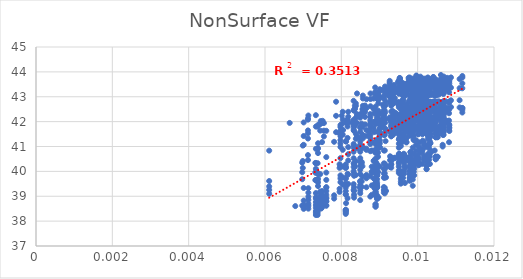
| Category | UTCI |
|---|---|
| 0.007333 | 41.801 |
| 0.008897 | 42.354 |
| 0.009115 | 42.436 |
| 0.009793 | 42.552 |
| 0.009893 | 42.621 |
| 0.010234 | 42.715 |
| 0.010282 | 42.77 |
| 0.010472 | 42.775 |
| 0.010515 | 42.787 |
| 0.010655 | 42.786 |
| 0.01067 | 42.8 |
| 0.007333 | 40.906 |
| 0.008897 | 41.915 |
| 0.009115 | 42.115 |
| 0.009793 | 42.474 |
| 0.009893 | 42.911 |
| 0.010234 | 43.022 |
| 0.010282 | 43.104 |
| 0.010472 | 43.135 |
| 0.010515 | 43.232 |
| 0.010655 | 43.233 |
| 0.01067 | 43.259 |
| 0.007333 | 40.328 |
| 0.008897 | 41.163 |
| 0.009115 | 41.752 |
| 0.009793 | 42.249 |
| 0.009893 | 42.954 |
| 0.010234 | 43.087 |
| 0.010282 | 43.181 |
| 0.010472 | 43.562 |
| 0.010515 | 43.586 |
| 0.010655 | 43.605 |
| 0.01067 | 43.638 |
| 0.007333 | 39.941 |
| 0.008897 | 40.753 |
| 0.009115 | 41.462 |
| 0.009793 | 41.677 |
| 0.009893 | 42.173 |
| 0.010234 | 42.326 |
| 0.010282 | 42.743 |
| 0.010472 | 43.111 |
| 0.010515 | 43.162 |
| 0.010655 | 43.194 |
| 0.01067 | 43.397 |
| 0.007333 | 39.65 |
| 0.008897 | 40.148 |
| 0.009115 | 40.839 |
| 0.009793 | 41.442 |
| 0.009893 | 41.636 |
| 0.010234 | 41.829 |
| 0.010282 | 42.291 |
| 0.010472 | 42.379 |
| 0.010515 | 42.444 |
| 0.010655 | 42.779 |
| 0.01067 | 43.118 |
| 0.007333 | 38.899 |
| 0.008897 | 39.919 |
| 0.009115 | 40.321 |
| 0.009793 | 40.58 |
| 0.009893 | 41.447 |
| 0.010234 | 41.664 |
| 0.010282 | 41.808 |
| 0.010472 | 42.223 |
| 0.010515 | 42.318 |
| 0.010655 | 42.383 |
| 0.01067 | 42.71 |
| 0.007333 | 38.765 |
| 0.008897 | 39.451 |
| 0.009115 | 40.1 |
| 0.009793 | 40.396 |
| 0.009893 | 41.278 |
| 0.010234 | 41.495 |
| 0.010282 | 41.667 |
| 0.010472 | 41.762 |
| 0.010515 | 42.188 |
| 0.010655 | 42.239 |
| 0.01067 | 42.303 |
| 0.007333 | 38.645 |
| 0.008897 | 39.325 |
| 0.009115 | 39.914 |
| 0.009793 | 40.198 |
| 0.009893 | 40.457 |
| 0.010234 | 41.036 |
| 0.010282 | 41.522 |
| 0.010472 | 41.642 |
| 0.010515 | 41.741 |
| 0.010655 | 41.837 |
| 0.01067 | 42.202 |
| 0.007333 | 38.536 |
| 0.008897 | 39.177 |
| 0.009115 | 39.746 |
| 0.009793 | 40.015 |
| 0.009893 | 40.269 |
| 0.010234 | 40.516 |
| 0.010282 | 41.062 |
| 0.010472 | 41.508 |
| 0.010515 | 41.613 |
| 0.010655 | 41.707 |
| 0.01067 | 41.798 |
| 0.007333 | 38.405 |
| 0.008897 | 39.055 |
| 0.009115 | 39.37 |
| 0.009793 | 39.889 |
| 0.009893 | 40.124 |
| 0.010234 | 40.391 |
| 0.010282 | 40.571 |
| 0.010472 | 41.369 |
| 0.010515 | 41.492 |
| 0.010655 | 41.584 |
| 0.01067 | 41.675 |
| 0.007333 | 38.334 |
| 0.008897 | 38.674 |
| 0.009115 | 39.249 |
| 0.009793 | 39.739 |
| 0.009893 | 39.994 |
| 0.010234 | 40.232 |
| 0.010282 | 40.455 |
| 0.010472 | 40.588 |
| 0.010515 | 41.375 |
| 0.010655 | 41.482 |
| 0.01067 | 41.572 |
| 0.007333 | 38.247 |
| 0.008897 | 38.587 |
| 0.009115 | 39.146 |
| 0.009793 | 39.629 |
| 0.009893 | 39.843 |
| 0.010234 | 40.092 |
| 0.010282 | 40.321 |
| 0.010472 | 40.488 |
| 0.010515 | 40.587 |
| 0.010655 | 41.068 |
| 0.01067 | 41.473 |
| 0.006647 | 41.948 |
| 0.008621 | 42.397 |
| 0.008354 | 42.508 |
| 0.009118 | 42.576 |
| 0.010105 | 42.635 |
| 0.009347 | 42.716 |
| 0.009812 | 42.768 |
| 0.010264 | 42.78 |
| 0.010136 | 42.79 |
| 0.010053 | 42.791 |
| 0.010415 | 42.802 |
| 0.007811 | 41.188 |
| 0.008621 | 41.885 |
| 0.008037 | 42.396 |
| 0.009118 | 42.662 |
| 0.010105 | 43.052 |
| 0.009347 | 43.035 |
| 0.009812 | 43.461 |
| 0.010058 | 43.497 |
| 0.010136 | 43.513 |
| 0.010053 | 43.521 |
| 0.010415 | 43.545 |
| 0.007319 | 40.34 |
| 0.008797 | 41.174 |
| 0.008037 | 42.086 |
| 0.009118 | 42.274 |
| 0.01032 | 42.68 |
| 0.009347 | 43.098 |
| 0.009812 | 43.359 |
| 0.010058 | 43.41 |
| 0.010136 | 43.597 |
| 0.009848 | 43.621 |
| 0.010415 | 43.643 |
| 0.007319 | 39.96 |
| 0.008797 | 40.841 |
| 0.008037 | 41.474 |
| 0.009308 | 42.02 |
| 0.01032 | 42.2 |
| 0.009705 | 42.35 |
| 0.009612 | 42.751 |
| 0.010058 | 43.114 |
| 0.010136 | 43.17 |
| 0.010053 | 43.367 |
| 0.010081 | 43.401 |
| 0.007319 | 39.649 |
| 0.008797 | 40.188 |
| 0.008037 | 40.866 |
| 0.009651 | 41.471 |
| 0.01032 | 41.679 |
| 0.009705 | 42.147 |
| 0.009612 | 42.301 |
| 0.010058 | 42.398 |
| 0.010136 | 42.733 |
| 0.009848 | 43.085 |
| 0.010081 | 43.136 |
| 0.007471 | 39.145 |
| 0.008797 | 39.947 |
| 0.008534 | 40.329 |
| 0.009651 | 41.274 |
| 0.01032 | 41.482 |
| 0.009705 | 41.686 |
| 0.009812 | 41.832 |
| 0.010058 | 42.239 |
| 0.010136 | 42.327 |
| 0.009848 | 42.399 |
| 0.010081 | 42.72 |
| 0.007811 | 39.038 |
| 0.008797 | 39.991 |
| 0.008534 | 40.379 |
| 0.009651 | 40.681 |
| 0.009678 | 41.594 |
| 0.009705 | 41.78 |
| 0.009612 | 41.959 |
| 0.010058 | 42.36 |
| 0.010136 | 42.46 |
| 0.009848 | 42.519 |
| 0.010081 | 42.605 |
| 0.007811 | 38.906 |
| 0.008495 | 39.582 |
| 0.008037 | 40.195 |
| 0.009651 | 40.5 |
| 0.01032 | 41.117 |
| 0.009705 | 41.335 |
| 0.009612 | 41.808 |
| 0.010058 | 41.928 |
| 0.010136 | 42.032 |
| 0.009848 | 42.427 |
| 0.010081 | 42.495 |
| 0.007471 | 38.804 |
| 0.008797 | 39.436 |
| 0.008037 | 39.756 |
| 0.009651 | 40.31 |
| 0.009678 | 40.595 |
| 0.009705 | 41.162 |
| 0.010315 | 41.361 |
| 0.010058 | 41.791 |
| 0.010136 | 41.89 |
| 0.009848 | 41.994 |
| 0.010415 | 42.091 |
| 0.007471 | 38.681 |
| 0.008797 | 39.056 |
| 0.008534 | 39.596 |
| 0.009651 | 40.187 |
| 0.009678 | 40.439 |
| 0.009507 | 40.664 |
| 0.010315 | 41.221 |
| 0.010058 | 41.661 |
| 0.010136 | 41.773 |
| 0.010053 | 41.877 |
| 0.010415 | 41.974 |
| 0.006794 | 38.605 |
| 0.00898 | 38.942 |
| 0.008037 | 39.472 |
| 0.009651 | 40.037 |
| 0.01032 | 40.297 |
| 0.010259 | 40.518 |
| 0.010315 | 40.727 |
| 0.010058 | 40.874 |
| 0.010136 | 41.66 |
| 0.010398 | 41.768 |
| 0.010415 | 41.874 |
| 0.007471 | 38.505 |
| 0.008495 | 38.845 |
| 0.008534 | 39.38 |
| 0.009651 | 39.916 |
| 0.009678 | 40.168 |
| 0.009507 | 40.366 |
| 0.010315 | 40.599 |
| 0.010058 | 40.763 |
| 0.010136 | 41.234 |
| 0.009848 | 41.659 |
| 0.010081 | 41.762 |
| 0.008285 | 41.962 |
| 0.008937 | 42.174 |
| 0.009871 | 42.522 |
| 0.009812 | 42.381 |
| 0.010016 | 42.655 |
| 0.010162 | 42.726 |
| 0.010559 | 42.787 |
| 0.010122 | 42.792 |
| 0.01083 | 42.803 |
| 0.01045 | 42.805 |
| 0.010555 | 42.815 |
| 0.007954 | 41.531 |
| 0.008937 | 41.976 |
| 0.009871 | 42.713 |
| 0.009812 | 42.971 |
| 0.010016 | 43.244 |
| 0.010162 | 43.341 |
| 0.010559 | 43.494 |
| 0.010122 | 43.517 |
| 0.01083 | 43.533 |
| 0.01045 | 43.545 |
| 0.010555 | 43.569 |
| 0.007954 | 40.141 |
| 0.008937 | 41.595 |
| 0.009871 | 41.862 |
| 0.009812 | 42.054 |
| 0.010016 | 42.767 |
| 0.010162 | 42.871 |
| 0.010559 | 43.137 |
| 0.010122 | 43.338 |
| 0.01083 | 43.366 |
| 0.009861 | 43.383 |
| 0.010555 | 43.482 |
| 0.007954 | 40.286 |
| 0.008937 | 41.111 |
| 0.009871 | 41.81 |
| 0.009616 | 42.347 |
| 0.010016 | 42.537 |
| 0.009959 | 42.97 |
| 0.009512 | 43.374 |
| 0.010122 | 43.588 |
| 0.01083 | 43.648 |
| 0.01045 | 43.69 |
| 0.010606 | 43.714 |
| 0.008116 | 39.702 |
| 0.008759 | 40.81 |
| 0.009871 | 41.56 |
| 0.009812 | 41.809 |
| 0.010016 | 42.312 |
| 0.009959 | 42.487 |
| 0.009512 | 42.631 |
| 0.010122 | 43.302 |
| 0.01083 | 43.363 |
| 0.009861 | 43.401 |
| 0.010606 | 43.613 |
| 0.008116 | 39.431 |
| 0.008937 | 40.292 |
| 0.009871 | 40.956 |
| 0.009812 | 41.61 |
| 0.010016 | 41.827 |
| 0.009959 | 42.321 |
| 0.010559 | 42.483 |
| 0.010122 | 42.572 |
| 0.010101 | 42.646 |
| 0.009861 | 43.023 |
| 0.010606 | 43.355 |
| 0.007954 | 39.301 |
| 0.008759 | 39.8 |
| 0.009871 | 40.433 |
| 0.009812 | 40.777 |
| 0.010039 | 41.662 |
| 0.009959 | 42.171 |
| 0.009512 | 42.032 |
| 0.010122 | 42.435 |
| 0.010101 | 42.532 |
| 0.009861 | 42.595 |
| 0.010606 | 42.659 |
| 0.007954 | 39.176 |
| 0.008937 | 39.903 |
| 0.009871 | 39.999 |
| 0.009812 | 40.573 |
| 0.010016 | 41.495 |
| 0.009959 | 41.713 |
| 0.009512 | 41.898 |
| 0.010122 | 42.301 |
| 0.010101 | 42.41 |
| 0.009861 | 42.505 |
| 0.010606 | 42.565 |
| 0.008116 | 39.07 |
| 0.008937 | 39.46 |
| 0.009871 | 39.838 |
| 0.009812 | 40.377 |
| 0.010039 | 40.978 |
| 0.009959 | 41.253 |
| 0.009512 | 41.745 |
| 0.010122 | 41.876 |
| 0.010101 | 42.277 |
| 0.009861 | 42.374 |
| 0.010287 | 42.482 |
| 0.008116 | 38.455 |
| 0.008937 | 39.347 |
| 0.009871 | 39.673 |
| 0.009812 | 40.279 |
| 0.010039 | 40.519 |
| 0.009959 | 41.066 |
| 0.009512 | 41.319 |
| 0.010122 | 41.749 |
| 0.01083 | 41.855 |
| 0.01045 | 41.949 |
| 0.010287 | 42.358 |
| 0.008116 | 38.386 |
| 0.008759 | 38.987 |
| 0.009667 | 39.534 |
| 0.009812 | 40.136 |
| 0.010016 | 40.368 |
| 0.009959 | 40.6 |
| 0.009952 | 40.836 |
| 0.010122 | 41.62 |
| 0.01083 | 41.757 |
| 0.010241 | 41.852 |
| 0.010555 | 42.255 |
| 0.008116 | 38.29 |
| 0.008937 | 38.889 |
| 0.009871 | 39.42 |
| 0.009616 | 39.737 |
| 0.010039 | 40.263 |
| 0.009959 | 40.46 |
| 0.009512 | 40.703 |
| 0.010122 | 40.858 |
| 0.01083 | 41.622 |
| 0.009861 | 41.753 |
| 0.010606 | 41.861 |
| 0.00751 | 42.032 |
| 0.008495 | 42.239 |
| 0.009433 | 42.333 |
| 0.009308 | 42.405 |
| 0.009725 | 42.465 |
| 0.009848 | 42.544 |
| 0.01032 | 42.596 |
| 0.009717 | 42.607 |
| 0.009762 | 42.611 |
| 0.010614 | 42.611 |
| 0.010411 | 42.623 |
| 0.007447 | 41.637 |
| 0.008495 | 42.156 |
| 0.008846 | 42.93 |
| 0.009308 | 42.973 |
| 0.009725 | 43.355 |
| 0.009848 | 43.174 |
| 0.01032 | 43.53 |
| 0.010058 | 43.555 |
| 0.009762 | 43.573 |
| 0.010614 | 43.58 |
| 0.010411 | 43.598 |
| 0.008124 | 41.201 |
| 0.008322 | 41.951 |
| 0.008846 | 42.531 |
| 0.009308 | 43.14 |
| 0.009395 | 43.265 |
| 0.009848 | 43.456 |
| 0.01032 | 43.698 |
| 0.010058 | 43.736 |
| 0.009762 | 43.758 |
| 0.010267 | 43.775 |
| 0.010411 | 43.793 |
| 0.008124 | 40.169 |
| 0.008495 | 41.068 |
| 0.008846 | 41.973 |
| 0.009506 | 42.201 |
| 0.009395 | 42.801 |
| 0.010259 | 43.25 |
| 0.010273 | 43.36 |
| 0.010058 | 43.415 |
| 0.009762 | 43.454 |
| 0.010614 | 43.548 |
| 0.010199 | 43.73 |
| 0.007447 | 39.892 |
| 0.008495 | 40.79 |
| 0.008846 | 41.749 |
| 0.009308 | 41.984 |
| 0.009395 | 42.186 |
| 0.010259 | 42.627 |
| 0.010273 | 43.043 |
| 0.010058 | 43.306 |
| 0.009762 | 43.345 |
| 0.010267 | 43.388 |
| 0.010199 | 43.424 |
| 0.007606 | 39.363 |
| 0.008322 | 40.528 |
| 0.008657 | 40.863 |
| 0.009308 | 41.811 |
| 0.009395 | 42.003 |
| 0.010259 | 42.219 |
| 0.01032 | 42.338 |
| 0.010058 | 42.998 |
| 0.009887 | 43.24 |
| 0.010267 | 43.308 |
| 0.010199 | 43.333 |
| 0.007447 | 39.19 |
| 0.008495 | 40.229 |
| 0.008657 | 40.913 |
| 0.009308 | 41.586 |
| 0.009635 | 42.127 |
| 0.010259 | 42.325 |
| 0.010273 | 42.49 |
| 0.010058 | 42.569 |
| 0.009887 | 42.649 |
| 0.010267 | 43.143 |
| 0.010199 | 43.508 |
| 0.007447 | 39.032 |
| 0.008495 | 40.065 |
| 0.008846 | 40.424 |
| 0.009308 | 41.412 |
| 0.009395 | 41.659 |
| 0.010259 | 41.874 |
| 0.010273 | 42.346 |
| 0.010058 | 42.457 |
| 0.009887 | 42.547 |
| 0.010267 | 42.625 |
| 0.010199 | 42.958 |
| 0.007606 | 38.918 |
| 0.008322 | 39.907 |
| 0.008846 | 40 |
| 0.009308 | 40.56 |
| 0.009635 | 41.504 |
| 0.010259 | 41.73 |
| 0.009783 | 42.216 |
| 0.010058 | 42.345 |
| 0.009887 | 42.435 |
| 0.010267 | 42.528 |
| 0.010203 | 42.607 |
| 0.007606 | 38.795 |
| 0.008322 | 39.487 |
| 0.008657 | 39.856 |
| 0.009308 | 40.426 |
| 0.009635 | 40.708 |
| 0.010259 | 41.606 |
| 0.009783 | 41.782 |
| 0.010058 | 42.223 |
| 0.009762 | 42.328 |
| 0.010614 | 42.424 |
| 0.010203 | 42.514 |
| 0.008124 | 38.722 |
| 0.008495 | 39.35 |
| 0.008657 | 39.722 |
| 0.009308 | 40.289 |
| 0.009395 | 40.548 |
| 0.010049 | 41.168 |
| 0.010312 | 41.666 |
| 0.010058 | 42.11 |
| 0.009762 | 42.228 |
| 0.010614 | 42.331 |
| 0.010411 | 42.419 |
| 0.007606 | 38.63 |
| 0.008495 | 39.233 |
| 0.008657 | 39.361 |
| 0.008951 | 40.18 |
| 0.009635 | 40.409 |
| 0.010259 | 41.017 |
| 0.009783 | 41.543 |
| 0.010058 | 41.704 |
| 0.009762 | 42.108 |
| 0.010267 | 42.226 |
| 0.010199 | 42.325 |
| 0.00746 | 42.021 |
| 0.009078 | 41.854 |
| 0.009628 | 42.279 |
| 0.009008 | 41.96 |
| 0.010362 | 42.429 |
| 0.009598 | 42.481 |
| 0.009785 | 42.537 |
| 0.009814 | 42.539 |
| 0.01117 | 42.54 |
| 0.009968 | 42.541 |
| 0.009965 | 42.558 |
| 0.007136 | 42.246 |
| 0.009078 | 42.128 |
| 0.008411 | 42.243 |
| 0.009008 | 43.008 |
| 0.010362 | 43.16 |
| 0.009598 | 43.231 |
| 0.009785 | 43.306 |
| 0.010686 | 43.325 |
| 0.01117 | 43.341 |
| 0.009968 | 43.337 |
| 0.009965 | 43.357 |
| 0.00699 | 41.037 |
| 0.008333 | 42.44 |
| 0.008411 | 43.132 |
| 0.009008 | 43.302 |
| 0.009144 | 43.411 |
| 0.009598 | 43.541 |
| 0.009785 | 43.776 |
| 0.010686 | 43.81 |
| 0.01117 | 43.834 |
| 0.009968 | 43.835 |
| 0.009965 | 43.855 |
| 0.00699 | 40.417 |
| 0.008333 | 41.894 |
| 0.008411 | 42.3 |
| 0.009195 | 43.118 |
| 0.009144 | 43.288 |
| 0.009598 | 43.435 |
| 0.009614 | 43.548 |
| 0.010686 | 43.747 |
| 0.01117 | 43.772 |
| 0.009968 | 43.786 |
| 0.010073 | 43.808 |
| 0.00699 | 40.137 |
| 0.008333 | 41.63 |
| 0.008411 | 41.946 |
| 0.009008 | 42.315 |
| 0.009144 | 43.13 |
| 0.009598 | 43.31 |
| 0.009614 | 43.438 |
| 0.010686 | 43.506 |
| 0.01117 | 43.537 |
| 0.009968 | 43.563 |
| 0.010073 | 43.753 |
| 0.007136 | 39.323 |
| 0.008333 | 41.051 |
| 0.008495 | 41.777 |
| 0.009008 | 42.005 |
| 0.009144 | 42.357 |
| 0.009598 | 43.212 |
| 0.009785 | 43.318 |
| 0.010686 | 43.402 |
| 0.009711 | 43.463 |
| 0.009968 | 43.501 |
| 0.010073 | 43.519 |
| 0.007136 | 39.143 |
| 0.008333 | 40.299 |
| 0.008495 | 41.591 |
| 0.009008 | 41.86 |
| 0.00981 | 42.116 |
| 0.009598 | 42.807 |
| 0.009614 | 43.251 |
| 0.010686 | 43.296 |
| 0.009711 | 43.373 |
| 0.009968 | 43.404 |
| 0.010073 | 43.45 |
| 0.007136 | 38.979 |
| 0.008333 | 39.822 |
| 0.008411 | 41.41 |
| 0.009008 | 41.71 |
| 0.009144 | 41.948 |
| 0.009598 | 42.399 |
| 0.009614 | 42.57 |
| 0.010686 | 43.231 |
| 0.009711 | 43.286 |
| 0.009968 | 43.342 |
| 0.010073 | 43.378 |
| 0.007136 | 38.855 |
| 0.008333 | 39.364 |
| 0.008411 | 40.929 |
| 0.009008 | 41.538 |
| 0.00981 | 41.84 |
| 0.009598 | 42.114 |
| 0.009698 | 42.453 |
| 0.010686 | 42.567 |
| 0.009711 | 43.206 |
| 0.009968 | 43.263 |
| 0.010032 | 43.319 |
| 0.007136 | 38.704 |
| 0.008333 | 39.212 |
| 0.008495 | 39.894 |
| 0.009008 | 41.426 |
| 0.00981 | 41.711 |
| 0.009598 | 42.02 |
| 0.009698 | 42.2 |
| 0.010686 | 42.467 |
| 0.01117 | 42.55 |
| 0.009968 | 42.896 |
| 0.010032 | 43.247 |
| 0.007136 | 38.613 |
| 0.008333 | 39.059 |
| 0.008495 | 39.451 |
| 0.009008 | 40.962 |
| 0.009144 | 41.551 |
| 0.009598 | 41.895 |
| 0.009698 | 42.104 |
| 0.010686 | 42.377 |
| 0.01117 | 42.477 |
| 0.009968 | 42.551 |
| 0.009965 | 42.901 |
| 0.007136 | 38.501 |
| 0.008333 | 38.943 |
| 0.008495 | 39.346 |
| 0.009195 | 40.203 |
| 0.00981 | 41.454 |
| 0.009598 | 41.771 |
| 0.009698 | 41.994 |
| 0.010686 | 42.298 |
| 0.01117 | 42.366 |
| 0.009968 | 42.46 |
| 0.010073 | 42.546 |
| 0.008046 | 41.661 |
| 0.008322 | 41.851 |
| 0.008534 | 41.919 |
| 0.009506 | 41.981 |
| 0.009539 | 42.038 |
| 0.009347 | 42.123 |
| 0.009267 | 42.17 |
| 0.00956 | 42.17 |
| 0.01034 | 42.17 |
| 0.009492 | 42.173 |
| 0.010407 | 42.185 |
| 0.007389 | 41.864 |
| 0.008322 | 42.043 |
| 0.008968 | 42.437 |
| 0.009506 | 42.237 |
| 0.009539 | 42.602 |
| 0.009347 | 42.426 |
| 0.009267 | 42.763 |
| 0.01013 | 42.778 |
| 0.01034 | 42.791 |
| 0.009492 | 42.786 |
| 0.010407 | 42.797 |
| 0.007543 | 41.941 |
| 0.008495 | 42.294 |
| 0.008354 | 42.639 |
| 0.009506 | 42.763 |
| 0.009611 | 42.863 |
| 0.009347 | 42.962 |
| 0.009267 | 43.027 |
| 0.01013 | 43.058 |
| 0.01034 | 43.065 |
| 0.010053 | 43.068 |
| 0.010407 | 43.076 |
| 0.007543 | 41.635 |
| 0.008621 | 42.647 |
| 0.008968 | 42.868 |
| 0.009118 | 43.021 |
| 0.009611 | 43.156 |
| 0.009705 | 43.435 |
| 0.009267 | 43.519 |
| 0.01013 | 43.554 |
| 0.01034 | 43.565 |
| 0.009492 | 43.571 |
| 0.010407 | 43.592 |
| 0.007543 | 41.404 |
| 0.008621 | 42.189 |
| 0.008968 | 42.736 |
| 0.008951 | 42.906 |
| 0.009611 | 43.05 |
| 0.009705 | 43.184 |
| 0.009267 | 43.29 |
| 0.01013 | 43.506 |
| 0.01034 | 43.514 |
| 0.010053 | 43.533 |
| 0.010407 | 43.55 |
| 0.007389 | 41.13 |
| 0.008495 | 41.757 |
| 0.009159 | 42.812 |
| 0.008951 | 43.021 |
| 0.009611 | 43.17 |
| 0.009705 | 43.336 |
| 0.009267 | 43.427 |
| 0.01013 | 43.484 |
| 0.010133 | 43.679 |
| 0.010053 | 43.711 |
| 0.010407 | 43.721 |
| 0.007389 | 40.931 |
| 0.008322 | 41.751 |
| 0.009159 | 42.658 |
| 0.008951 | 43.175 |
| 0.009611 | 43.364 |
| 0.009705 | 43.52 |
| 0.009267 | 43.639 |
| 0.01013 | 43.688 |
| 0.010133 | 43.728 |
| 0.010053 | 43.745 |
| 0.010407 | 43.789 |
| 0.007389 | 40.735 |
| 0.008495 | 41.346 |
| 0.008354 | 42.524 |
| 0.008951 | 43.068 |
| 0.009611 | 43.257 |
| 0.009705 | 43.434 |
| 0.009267 | 43.569 |
| 0.01013 | 43.639 |
| 0.010133 | 43.676 |
| 0.010053 | 43.72 |
| 0.010407 | 43.743 |
| 0.007389 | 39.908 |
| 0.008495 | 41.205 |
| 0.008354 | 41.836 |
| 0.008951 | 42.915 |
| 0.009611 | 43.172 |
| 0.009705 | 43.343 |
| 0.009806 | 43.489 |
| 0.01013 | 43.576 |
| 0.010133 | 43.62 |
| 0.010053 | 43.669 |
| 0.010419 | 43.715 |
| 0.007389 | 39.702 |
| 0.008495 | 41.049 |
| 0.009159 | 41.703 |
| 0.008951 | 42.262 |
| 0.009611 | 43.072 |
| 0.009347 | 43.279 |
| 0.009806 | 43.425 |
| 0.009919 | 43.519 |
| 0.01034 | 43.571 |
| 0.009492 | 43.621 |
| 0.010419 | 43.669 |
| 0.007389 | 39.558 |
| 0.008495 | 40.532 |
| 0.008722 | 41.588 |
| 0.008951 | 42.149 |
| 0.009611 | 42.38 |
| 0.009347 | 43.19 |
| 0.009806 | 43.362 |
| 0.01013 | 43.454 |
| 0.01034 | 43.535 |
| 0.009492 | 43.578 |
| 0.010407 | 43.628 |
| 0.007389 | 39.41 |
| 0.008495 | 40.388 |
| 0.009159 | 41.216 |
| 0.009308 | 42.051 |
| 0.009611 | 42.287 |
| 0.009347 | 42.809 |
| 0.009806 | 43.288 |
| 0.009919 | 43.403 |
| 0.01034 | 43.449 |
| 0.010053 | 43.535 |
| 0.010407 | 43.585 |
| 0.007977 | 41.628 |
| 0.008759 | 41.867 |
| 0.009368 | 41.869 |
| 0.009616 | 41.959 |
| 0.009831 | 42.01 |
| 0.009959 | 42.083 |
| 0.010063 | 42.15 |
| 0.010122 | 42.146 |
| 0.010202 | 42.151 |
| 0.010241 | 42.147 |
| 0.010295 | 42.163 |
| 0.007977 | 41.783 |
| 0.008759 | 41.841 |
| 0.009368 | 42.234 |
| 0.009616 | 42.317 |
| 0.009831 | 42.41 |
| 0.009959 | 42.489 |
| 0.010063 | 42.568 |
| 0.010122 | 42.569 |
| 0.010202 | 42.594 |
| 0.010241 | 42.587 |
| 0.010295 | 42.592 |
| 0.007977 | 41.525 |
| 0.008759 | 41.684 |
| 0.009368 | 42.288 |
| 0.009616 | 42.215 |
| 0.009831 | 42.599 |
| 0.009959 | 42.449 |
| 0.010063 | 42.746 |
| 0.010122 | 42.557 |
| 0.010202 | 42.769 |
| 0.010241 | 42.555 |
| 0.010295 | 42.778 |
| 0.007977 | 41.859 |
| 0.008759 | 42.305 |
| 0.009368 | 42.742 |
| 0.009616 | 42.899 |
| 0.009831 | 43.009 |
| 0.009959 | 43.178 |
| 0.010063 | 43.282 |
| 0.010122 | 43.29 |
| 0.010202 | 43.296 |
| 0.010241 | 43.304 |
| 0.010295 | 43.325 |
| 0.007977 | 41.417 |
| 0.008759 | 42.185 |
| 0.009368 | 42.336 |
| 0.009616 | 42.816 |
| 0.009831 | 42.933 |
| 0.009959 | 43.037 |
| 0.010063 | 43.151 |
| 0.010122 | 43.274 |
| 0.010202 | 43.276 |
| 0.010241 | 43.278 |
| 0.010295 | 43.291 |
| 0.007977 | 41.26 |
| 0.008759 | 42.057 |
| 0.009356 | 42.259 |
| 0.009616 | 42.448 |
| 0.009831 | 42.879 |
| 0.009959 | 43.016 |
| 0.010063 | 43.109 |
| 0.010122 | 43.139 |
| 0.010202 | 43.161 |
| 0.010241 | 43.197 |
| 0.010295 | 43.281 |
| 0.007977 | 41.126 |
| 0.008759 | 41.934 |
| 0.009356 | 42.148 |
| 0.009616 | 42.386 |
| 0.009831 | 42.845 |
| 0.009959 | 42.985 |
| 0.010063 | 43.09 |
| 0.010122 | 43.098 |
| 0.010202 | 43.128 |
| 0.010241 | 43.146 |
| 0.010295 | 43.25 |
| 0.007977 | 40.982 |
| 0.008759 | 41.835 |
| 0.009368 | 42.062 |
| 0.009616 | 42.306 |
| 0.009831 | 42.462 |
| 0.009959 | 42.934 |
| 0.010063 | 43.063 |
| 0.010122 | 43.084 |
| 0.010202 | 43.101 |
| 0.010241 | 43.134 |
| 0.010295 | 43.224 |
| 0.007977 | 40.531 |
| 0.008759 | 41.464 |
| 0.009368 | 41.969 |
| 0.009616 | 42.21 |
| 0.009831 | 42.393 |
| 0.009959 | 42.544 |
| 0.010063 | 42.69 |
| 0.010122 | 43.046 |
| 0.010202 | 43.073 |
| 0.010241 | 43.106 |
| 0.010295 | 43.221 |
| 0.007977 | 39.839 |
| 0.008759 | 41.34 |
| 0.009356 | 41.875 |
| 0.009616 | 42.169 |
| 0.009831 | 42.335 |
| 0.009959 | 42.522 |
| 0.010063 | 42.652 |
| 0.010122 | 43.021 |
| 0.010202 | 43.035 |
| 0.010241 | 43.078 |
| 0.010295 | 43.19 |
| 0.007977 | 39.718 |
| 0.008759 | 41.21 |
| 0.009368 | 41.527 |
| 0.009616 | 42.094 |
| 0.009831 | 42.256 |
| 0.009959 | 42.453 |
| 0.010063 | 42.618 |
| 0.010122 | 42.82 |
| 0.010202 | 43.027 |
| 0.010241 | 43.054 |
| 0.010295 | 43.164 |
| 0.007977 | 39.565 |
| 0.008759 | 41.1 |
| 0.009356 | 41.469 |
| 0.009616 | 41.756 |
| 0.009831 | 42.207 |
| 0.009959 | 42.382 |
| 0.010063 | 42.571 |
| 0.010122 | 42.784 |
| 0.010202 | 42.973 |
| 0.010241 | 43.029 |
| 0.010295 | 43.139 |
| 0.007126 | 41.646 |
| 0.00801 | 41.902 |
| 0.008172 | 41.975 |
| 0.009118 | 42.038 |
| 0.009291 | 42.096 |
| 0.009705 | 42.18 |
| 0.00967 | 42.231 |
| 0.010264 | 42.23 |
| 0.010115 | 42.23 |
| 0.009848 | 42.235 |
| 0.010089 | 42.249 |
| 0.007126 | 42.079 |
| 0.00801 | 42.24 |
| 0.008565 | 42.636 |
| 0.009118 | 42.44 |
| 0.009291 | 42.87 |
| 0.009705 | 42.696 |
| 0.00967 | 43.039 |
| 0.010264 | 43.051 |
| 0.010115 | 43.064 |
| 0.009848 | 43.06 |
| 0.010089 | 43.069 |
| 0.007126 | 42.124 |
| 0.008322 | 42.461 |
| 0.007862 | 42.8 |
| 0.009118 | 42.921 |
| 0.009252 | 43.022 |
| 0.009705 | 43.116 |
| 0.00967 | 43.185 |
| 0.010264 | 43.284 |
| 0.010115 | 43.29 |
| 0.010053 | 43.292 |
| 0.010089 | 43.298 |
| 0.007126 | 41.534 |
| 0.008322 | 42.836 |
| 0.008565 | 43.047 |
| 0.009308 | 43.185 |
| 0.009252 | 43.314 |
| 0.010049 | 43.595 |
| 0.010171 | 43.686 |
| 0.010264 | 43.716 |
| 0.010115 | 43.724 |
| 0.009848 | 43.729 |
| 0.009531 | 43.75 |
| 0.007126 | 41.32 |
| 0.008322 | 42.068 |
| 0.008565 | 42.931 |
| 0.009308 | 43.089 |
| 0.009252 | 43.222 |
| 0.010049 | 43.345 |
| 0.010171 | 43.454 |
| 0.010264 | 43.673 |
| 0.010115 | 43.679 |
| 0.010053 | 43.697 |
| 0.009531 | 43.71 |
| 0.00611 | 40.834 |
| 0.008322 | 41.656 |
| 0.008565 | 42.501 |
| 0.009308 | 43.011 |
| 0.009252 | 43.148 |
| 0.010049 | 43.303 |
| 0.00967 | 43.389 |
| 0.010264 | 43.437 |
| 0.010115 | 43.639 |
| 0.010053 | 43.668 |
| 0.009531 | 43.676 |
| 0.007126 | 40.655 |
| 0.00801 | 41.485 |
| 0.008565 | 42.356 |
| 0.009308 | 43.185 |
| 0.008887 | 43.374 |
| 0.010049 | 43.516 |
| 0.010171 | 43.632 |
| 0.010264 | 43.663 |
| 0.010115 | 43.702 |
| 0.010053 | 43.716 |
| 0.009531 | 43.756 |
| 0.007126 | 40.454 |
| 0.008322 | 41.099 |
| 0.007862 | 42.233 |
| 0.009308 | 43.086 |
| 0.009252 | 43.267 |
| 0.010049 | 43.442 |
| 0.010171 | 43.574 |
| 0.010264 | 43.622 |
| 0.010115 | 43.657 |
| 0.010053 | 43.695 |
| 0.009531 | 43.714 |
| 0.00611 | 39.612 |
| 0.008322 | 40.953 |
| 0.007862 | 41.575 |
| 0.009308 | 42.636 |
| 0.008887 | 43.189 |
| 0.010049 | 43.355 |
| 0.00967 | 43.5 |
| 0.010264 | 43.567 |
| 0.010115 | 43.606 |
| 0.010053 | 43.65 |
| 0.010415 | 43.693 |
| 0.00611 | 39.395 |
| 0.008322 | 40.788 |
| 0.008565 | 41.447 |
| 0.009308 | 41.988 |
| 0.008887 | 43.095 |
| 0.010049 | 43.294 |
| 0.00967 | 43.439 |
| 0.010264 | 43.516 |
| 0.010115 | 43.561 |
| 0.009848 | 43.602 |
| 0.010415 | 43.65 |
| 0.00611 | 39.253 |
| 0.008322 | 40.325 |
| 0.008565 | 41.328 |
| 0.009308 | 41.882 |
| 0.009252 | 42.107 |
| 0.010049 | 42.901 |
| 0.00967 | 43.375 |
| 0.010264 | 43.448 |
| 0.010115 | 43.521 |
| 0.010053 | 43.564 |
| 0.010089 | 43.61 |
| 0.00611 | 39.101 |
| 0.008322 | 40.178 |
| 0.008565 | 40.974 |
| 0.009308 | 41.796 |
| 0.008887 | 42.016 |
| 0.010049 | 42.509 |
| 0.00967 | 43.304 |
| 0.010264 | 43.4 |
| 0.010115 | 43.443 |
| 0.010053 | 43.519 |
| 0.009531 | 43.568 |
| 0.007014 | 41.967 |
| 0.008163 | 41.805 |
| 0.008574 | 42.3 |
| 0.009008 | 41.981 |
| 0.010557 | 42.447 |
| 0.010234 | 42.511 |
| 0.010471 | 42.561 |
| 0.009814 | 42.564 |
| 0.010775 | 42.564 |
| 0.011099 | 42.569 |
| 0.010873 | 42.584 |
| 0.007333 | 42.259 |
| 0.008163 | 42.069 |
| 0.00838 | 42.732 |
| 0.009008 | 42.945 |
| 0.010557 | 43.089 |
| 0.010234 | 43.179 |
| 0.010471 | 43.239 |
| 0.010686 | 43.335 |
| 0.010775 | 43.35 |
| 0.011099 | 43.347 |
| 0.010873 | 43.366 |
| 0.007014 | 41.421 |
| 0.008897 | 42.605 |
| 0.008961 | 43.095 |
| 0.009008 | 43.224 |
| 0.0099 | 43.325 |
| 0.010234 | 43.468 |
| 0.010471 | 43.702 |
| 0.010686 | 43.736 |
| 0.010775 | 43.76 |
| 0.009968 | 43.757 |
| 0.010873 | 43.776 |
| 0.007014 | 41.068 |
| 0.008163 | 42.078 |
| 0.00838 | 42.632 |
| 0.009793 | 43.058 |
| 0.0099 | 43.216 |
| 0.009402 | 43.369 |
| 0.00938 | 43.469 |
| 0.010686 | 43.676 |
| 0.010775 | 43.7 |
| 0.011099 | 43.714 |
| 0.009804 | 43.74 |
| 0.007333 | 40.102 |
| 0.008163 | 41.345 |
| 0.00838 | 42.153 |
| 0.009008 | 42.327 |
| 0.0099 | 43.07 |
| 0.009402 | 43.257 |
| 0.00938 | 43.376 |
| 0.010686 | 43.433 |
| 0.010775 | 43.459 |
| 0.009968 | 43.489 |
| 0.009804 | 43.514 |
| 0.007014 | 39.333 |
| 0.008897 | 40.793 |
| 0.00838 | 41.508 |
| 0.009008 | 41.724 |
| 0.0099 | 42.367 |
| 0.009402 | 43.166 |
| 0.010471 | 43.269 |
| 0.010686 | 43.339 |
| 0.009641 | 43.395 |
| 0.009968 | 43.431 |
| 0.009804 | 43.448 |
| 0.007333 | 39.128 |
| 0.008897 | 40.515 |
| 0.00838 | 41.308 |
| 0.009008 | 41.587 |
| 0.010337 | 41.954 |
| 0.009402 | 42.772 |
| 0.00938 | 42.918 |
| 0.010686 | 43.244 |
| 0.009641 | 43.313 |
| 0.009968 | 43.343 |
| 0.009804 | 43.379 |
| 0.007333 | 38.958 |
| 0.008163 | 39.899 |
| 0.008961 | 40.752 |
| 0.009008 | 41.43 |
| 0.0099 | 41.672 |
| 0.009402 | 42.361 |
| 0.00938 | 42.815 |
| 0.010686 | 43.18 |
| 0.009641 | 43.234 |
| 0.009968 | 43.289 |
| 0.009804 | 43.321 |
| 0.007014 | 38.827 |
| 0.008897 | 39.364 |
| 0.008961 | 40.583 |
| 0.009008 | 41.25 |
| 0.010337 | 41.532 |
| 0.009402 | 41.777 |
| 0.010635 | 42.102 |
| 0.010686 | 42.516 |
| 0.009641 | 43.156 |
| 0.009968 | 43.215 |
| 0.010072 | 43.266 |
| 0.007014 | 38.669 |
| 0.008897 | 39.187 |
| 0.00838 | 40.407 |
| 0.009008 | 41.127 |
| 0.010337 | 41.408 |
| 0.009598 | 41.692 |
| 0.010635 | 41.859 |
| 0.010686 | 42.118 |
| 0.010775 | 42.502 |
| 0.011099 | 42.86 |
| 0.010072 | 43.198 |
| 0.007014 | 38.588 |
| 0.008897 | 39.04 |
| 0.008961 | 39.973 |
| 0.009008 | 40.972 |
| 0.0099 | 41.264 |
| 0.009402 | 41.561 |
| 0.00938 | 41.777 |
| 0.010686 | 42.037 |
| 0.010775 | 42.439 |
| 0.01018 | 42.504 |
| 0.010873 | 42.857 |
| 0.007014 | 38.493 |
| 0.008163 | 38.919 |
| 0.00838 | 39.855 |
| 0.009008 | 40.196 |
| 0.010337 | 41.135 |
| 0.009598 | 41.433 |
| 0.010635 | 41.664 |
| 0.010686 | 41.964 |
| 0.010775 | 42.028 |
| 0.009968 | 42.425 |
| 0.009804 | 42.5 |
| 0.007447 | 41.902 |
| 0.00818 | 42.394 |
| 0.008658 | 42.545 |
| 0.008764 | 42.618 |
| 0.009085 | 42.678 |
| 0.009507 | 42.767 |
| 0.010053 | 42.811 |
| 0.01013 | 42.822 |
| 0.009768 | 42.825 |
| 0.010267 | 42.831 |
| 0.009913 | 42.844 |
| 0.007606 | 41.631 |
| 0.00818 | 42.196 |
| 0.008658 | 42.899 |
| 0.008764 | 42.908 |
| 0.009085 | 43.275 |
| 0.009507 | 43.12 |
| 0.010053 | 43.45 |
| 0.009919 | 43.546 |
| 0.009768 | 43.564 |
| 0.010267 | 43.572 |
| 0.009913 | 43.587 |
| 0.007606 | 40.574 |
| 0.00818 | 41.965 |
| 0.008855 | 42.501 |
| 0.008764 | 43.131 |
| 0.009401 | 43.261 |
| 0.009507 | 43.377 |
| 0.010053 | 43.62 |
| 0.009919 | 43.66 |
| 0.009768 | 43.681 |
| 0.010053 | 43.699 |
| 0.009913 | 43.715 |
| 0.007606 | 39.951 |
| 0.00818 | 40.976 |
| 0.008658 | 41.662 |
| 0.009118 | 42.191 |
| 0.009401 | 42.942 |
| 0.009507 | 43.25 |
| 0.010497 | 43.349 |
| 0.009919 | 43.403 |
| 0.009768 | 43.438 |
| 0.010267 | 43.462 |
| 0.009872 | 43.658 |
| 0.007606 | 39.656 |
| 0.00818 | 40.69 |
| 0.008658 | 41.427 |
| 0.009308 | 41.676 |
| 0.009401 | 42.183 |
| 0.009507 | 42.647 |
| 0.010497 | 43.05 |
| 0.009919 | 43.303 |
| 0.009768 | 43.338 |
| 0.010053 | 43.379 |
| 0.009872 | 43.41 |
| 0.007606 | 39.353 |
| 0.00818 | 40.438 |
| 0.008943 | 40.916 |
| 0.009308 | 41.497 |
| 0.009401 | 41.703 |
| 0.009507 | 42.223 |
| 0.010053 | 42.342 |
| 0.009919 | 43.008 |
| 0.009966 | 43.243 |
| 0.010053 | 43.307 |
| 0.009872 | 43.332 |
| 0.007606 | 39.209 |
| 0.008358 | 40.192 |
| 0.008943 | 40.97 |
| 0.009308 | 41.578 |
| 0.009523 | 41.842 |
| 0.009507 | 42.048 |
| 0.010497 | 42.514 |
| 0.009919 | 42.591 |
| 0.009966 | 42.673 |
| 0.010053 | 43.179 |
| 0.009872 | 43.53 |
| 0.007606 | 39.058 |
| 0.008322 | 40.009 |
| 0.008855 | 40.426 |
| 0.009308 | 41.411 |
| 0.009401 | 41.651 |
| 0.009507 | 41.903 |
| 0.010497 | 42.071 |
| 0.009919 | 42.177 |
| 0.009966 | 42.567 |
| 0.010053 | 42.652 |
| 0.009872 | 42.998 |
| 0.007606 | 38.926 |
| 0.00818 | 39.876 |
| 0.008855 | 40.009 |
| 0.009308 | 40.544 |
| 0.009523 | 41.511 |
| 0.009507 | 41.737 |
| 0.010215 | 41.945 |
| 0.009919 | 42.072 |
| 0.009966 | 42.155 |
| 0.010053 | 42.556 |
| 0.010077 | 42.636 |
| 0.007606 | 38.789 |
| 0.00818 | 39.494 |
| 0.008943 | 39.846 |
| 0.009308 | 40.422 |
| 0.009523 | 40.703 |
| 0.009507 | 41.609 |
| 0.010215 | 41.795 |
| 0.009919 | 41.959 |
| 0.009768 | 42.057 |
| 0.010267 | 42.46 |
| 0.010077 | 42.543 |
| 0.007447 | 38.702 |
| 0.008495 | 39.362 |
| 0.008855 | 39.708 |
| 0.009308 | 40.273 |
| 0.009401 | 40.534 |
| 0.009507 | 41.109 |
| 0.009845 | 41.675 |
| 0.009919 | 41.836 |
| 0.009768 | 41.967 |
| 0.009904 | 42.064 |
| 0.009913 | 42.151 |
| 0.007606 | 38.622 |
| 0.008322 | 39.251 |
| 0.008943 | 39.371 |
| 0.009308 | 40.149 |
| 0.009523 | 40.406 |
| 0.009507 | 40.951 |
| 0.010215 | 41.56 |
| 0.009919 | 41.723 |
| 0.009768 | 41.833 |
| 0.010053 | 41.969 |
| 0.009872 | 42.063 |
| 0.008116 | 41.959 |
| 0.008937 | 42.368 |
| 0.009559 | 42.498 |
| 0.009812 | 42.595 |
| 0.010016 | 42.658 |
| 0.010162 | 42.73 |
| 0.010446 | 42.791 |
| 0.010329 | 42.796 |
| 0.010682 | 42.807 |
| 0.01045 | 42.809 |
| 0.010732 | 42.818 |
| 0.008116 | 41.208 |
| 0.008937 | 41.946 |
| 0.009559 | 42.674 |
| 0.009812 | 42.946 |
| 0.010016 | 43.23 |
| 0.010162 | 43.33 |
| 0.010446 | 43.411 |
| 0.010329 | 43.434 |
| 0.010682 | 43.522 |
| 0.01045 | 43.534 |
| 0.010732 | 43.556 |
| 0.008116 | 40.132 |
| 0.008937 | 41.281 |
| 0.009559 | 41.525 |
| 0.009812 | 42.039 |
| 0.010016 | 42.761 |
| 0.010162 | 43.017 |
| 0.010446 | 43.113 |
| 0.010329 | 43.325 |
| 0.010682 | 43.355 |
| 0.01045 | 43.373 |
| 0.010732 | 43.399 |
| 0.008116 | 40.278 |
| 0.008937 | 41.196 |
| 0.009559 | 41.781 |
| 0.009812 | 42.354 |
| 0.010016 | 42.537 |
| 0.010162 | 42.984 |
| 0.010446 | 43.388 |
| 0.010329 | 43.589 |
| 0.010682 | 43.643 |
| 0.01045 | 43.685 |
| 0.010609 | 43.875 |
| 0.008116 | 39.731 |
| 0.008937 | 40.902 |
| 0.009559 | 41.247 |
| 0.009812 | 41.81 |
| 0.010016 | 42.018 |
| 0.010162 | 42.492 |
| 0.010446 | 42.634 |
| 0.010329 | 43.316 |
| 0.010682 | 43.375 |
| 0.01045 | 43.57 |
| 0.010609 | 43.452 |
| 0.008116 | 39.509 |
| 0.008937 | 40.037 |
| 0.009559 | 41.015 |
| 0.009812 | 41.613 |
| 0.010016 | 41.83 |
| 0.010162 | 42.034 |
| 0.010446 | 42.487 |
| 0.010329 | 42.574 |
| 0.010682 | 42.653 |
| 0.01045 | 43.04 |
| 0.010609 | 43.366 |
| 0.008116 | 39.353 |
| 0.008937 | 39.824 |
| 0.009559 | 40.44 |
| 0.009812 | 40.779 |
| 0.010016 | 41.667 |
| 0.010162 | 41.874 |
| 0.010446 | 42.05 |
| 0.010329 | 42.137 |
| 0.010682 | 42.53 |
| 0.01045 | 42.605 |
| 0.010609 | 42.668 |
| 0.008116 | 39.209 |
| 0.008937 | 39.683 |
| 0.009559 | 40.008 |
| 0.009812 | 40.58 |
| 0.010016 | 41.496 |
| 0.010162 | 41.711 |
| 0.010446 | 41.896 |
| 0.010329 | 42.014 |
| 0.010682 | 42.115 |
| 0.01045 | 42.514 |
| 0.010609 | 42.565 |
| 0.008116 | 39.078 |
| 0.008937 | 39.547 |
| 0.009559 | 39.855 |
| 0.009812 | 40.385 |
| 0.010016 | 40.678 |
| 0.010162 | 41.185 |
| 0.010269 | 41.743 |
| 0.010329 | 41.88 |
| 0.010682 | 41.986 |
| 0.01045 | 42.089 |
| 0.010622 | 42.182 |
| 0.008116 | 38.455 |
| 0.008937 | 39.413 |
| 0.009559 | 39.704 |
| 0.009812 | 40.264 |
| 0.010016 | 40.53 |
| 0.010162 | 41.066 |
| 0.010269 | 41.322 |
| 0.010329 | 41.75 |
| 0.010682 | 41.858 |
| 0.01045 | 41.978 |
| 0.010622 | 42.07 |
| 0.008116 | 38.411 |
| 0.008937 | 39.034 |
| 0.009559 | 39.589 |
| 0.009812 | 40.123 |
| 0.010016 | 40.371 |
| 0.010162 | 40.61 |
| 0.010446 | 40.839 |
| 0.010329 | 41.631 |
| 0.010682 | 41.753 |
| 0.01045 | 41.864 |
| 0.010732 | 41.963 |
| 0.008116 | 38.34 |
| 0.008937 | 38.922 |
| 0.009559 | 39.506 |
| 0.009812 | 39.756 |
| 0.010016 | 40.248 |
| 0.010162 | 40.462 |
| 0.010269 | 40.696 |
| 0.010329 | 40.86 |
| 0.010682 | 41.62 |
| 0.01045 | 41.757 |
| 0.010609 | 41.867 |
| 0.007495 | 41.952 |
| 0.008864 | 42.327 |
| 0.008553 | 42.497 |
| 0.009506 | 42.579 |
| 0.010121 | 42.644 |
| 0.009912 | 42.718 |
| 0.009585 | 42.775 |
| 0.010477 | 42.783 |
| 0.010822 | 42.796 |
| 0.010267 | 42.799 |
| 0.010131 | 42.81 |
| 0.007495 | 41.177 |
| 0.008864 | 41.581 |
| 0.008553 | 42.363 |
| 0.009506 | 42.66 |
| 0.010121 | 43.201 |
| 0.009912 | 43.039 |
| 0.009585 | 43.384 |
| 0.01013 | 43.414 |
| 0.010822 | 43.437 |
| 0.010267 | 43.51 |
| 0.010131 | 43.531 |
| 0.006975 | 40.35 |
| 0.008864 | 41.172 |
| 0.008553 | 41.779 |
| 0.009506 | 42.275 |
| 0.010121 | 42.991 |
| 0.009912 | 43.108 |
| 0.009585 | 43.361 |
| 0.01013 | 43.404 |
| 0.010822 | 43.604 |
| 0.01049 | 43.629 |
| 0.010131 | 43.654 |
| 0.006975 | 39.966 |
| 0.008864 | 40.844 |
| 0.008553 | 41.478 |
| 0.009506 | 41.724 |
| 0.010121 | 42.212 |
| 0.009705 | 42.356 |
| 0.009585 | 42.777 |
| 0.01013 | 43.122 |
| 0.010822 | 43.18 |
| 0.010267 | 43.368 |
| 0.010131 | 43.405 |
| 0.006975 | 39.684 |
| 0.008864 | 40.198 |
| 0.008553 | 40.939 |
| 0.009506 | 41.475 |
| 0.010121 | 41.691 |
| 0.009705 | 41.858 |
| 0.009585 | 42.308 |
| 0.01013 | 42.403 |
| 0.010822 | 42.762 |
| 0.01049 | 43.103 |
| 0.010131 | 43.149 |
| 0.007495 | 39.208 |
| 0.008864 | 39.708 |
| 0.0089 | 40.346 |
| 0.009506 | 41.281 |
| 0.010121 | 41.489 |
| 0.009705 | 41.705 |
| 0.009585 | 42.15 |
| 0.01013 | 42.247 |
| 0.010822 | 42.335 |
| 0.01049 | 42.414 |
| 0.010131 | 42.748 |
| 0.007495 | 39.043 |
| 0.009171 | 39.758 |
| 0.0089 | 40.382 |
| 0.009506 | 40.689 |
| 0.009277 | 41.601 |
| 0.009705 | 41.796 |
| 0.009585 | 41.969 |
| 0.01013 | 42.065 |
| 0.010822 | 42.476 |
| 0.01049 | 42.535 |
| 0.010131 | 42.612 |
| 0.007495 | 38.915 |
| 0.008495 | 39.614 |
| 0.008553 | 40.205 |
| 0.009506 | 40.511 |
| 0.010121 | 40.765 |
| 0.009705 | 41.353 |
| 0.009585 | 41.816 |
| 0.01013 | 41.933 |
| 0.010822 | 42.044 |
| 0.01049 | 42.447 |
| 0.010131 | 42.505 |
| 0.007495 | 38.812 |
| 0.008864 | 39.471 |
| 0.008553 | 39.792 |
| 0.009506 | 40.31 |
| 0.009277 | 40.606 |
| 0.009705 | 41.182 |
| 0.009585 | 41.305 |
| 0.01013 | 41.8 |
| 0.010822 | 41.896 |
| 0.01049 | 42.014 |
| 0.010635 | 42.412 |
| 0.007495 | 38.676 |
| 0.008864 | 39.337 |
| 0.0089 | 39.66 |
| 0.009506 | 40.192 |
| 0.009277 | 40.451 |
| 0.009912 | 40.682 |
| 0.009585 | 41.166 |
| 0.010351 | 41.676 |
| 0.010822 | 41.776 |
| 0.010267 | 41.891 |
| 0.010635 | 41.987 |
| 0.006975 | 38.623 |
| 0.009171 | 39.213 |
| 0.0089 | 39.535 |
| 0.009506 | 40.042 |
| 0.010121 | 40.303 |
| 0.009705 | 40.539 |
| 0.009836 | 40.735 |
| 0.01013 | 40.886 |
| 0.010822 | 41.668 |
| 0.01049 | 41.777 |
| 0.010131 | 41.88 |
| 0.007495 | 38.549 |
| 0.008495 | 39.121 |
| 0.0089 | 39.444 |
| 0.009506 | 39.938 |
| 0.009277 | 40.175 |
| 0.009912 | 40.378 |
| 0.009585 | 40.609 |
| 0.010351 | 40.774 |
| 0.010822 | 41.172 |
| 0.01049 | 41.669 |
| 0.010131 | 41.768 |
| 0.007379 | 41.801 |
| 0.008897 | 42.354 |
| 0.009138 | 42.436 |
| 0.009793 | 42.552 |
| 0.009893 | 42.621 |
| 0.010234 | 42.728 |
| 0.010293 | 42.77 |
| 0.010472 | 42.775 |
| 0.010524 | 42.787 |
| 0.010655 | 42.795 |
| 0.010678 | 42.808 |
| 0.007379 | 40.906 |
| 0.008897 | 41.915 |
| 0.009138 | 42.115 |
| 0.009793 | 42.474 |
| 0.009893 | 42.911 |
| 0.010234 | 43.038 |
| 0.010293 | 43.108 |
| 0.010472 | 43.135 |
| 0.010524 | 43.232 |
| 0.010655 | 43.234 |
| 0.010678 | 43.263 |
| 0.007379 | 40.328 |
| 0.008897 | 41.101 |
| 0.009138 | 42.068 |
| 0.009793 | 42.249 |
| 0.009893 | 42.949 |
| 0.010234 | 43.106 |
| 0.010293 | 43.185 |
| 0.010472 | 43.562 |
| 0.010524 | 43.586 |
| 0.010655 | 43.605 |
| 0.010678 | 43.642 |
| 0.007379 | 39.941 |
| 0.008897 | 40.753 |
| 0.009138 | 41.462 |
| 0.009793 | 41.677 |
| 0.009893 | 42.167 |
| 0.010234 | 42.342 |
| 0.010293 | 42.757 |
| 0.010472 | 43.111 |
| 0.010524 | 43.162 |
| 0.010655 | 43.198 |
| 0.010678 | 43.394 |
| 0.007379 | 39.65 |
| 0.008897 | 40.148 |
| 0.009138 | 40.839 |
| 0.009793 | 41.442 |
| 0.009893 | 41.622 |
| 0.010234 | 42.146 |
| 0.010293 | 42.293 |
| 0.010472 | 42.38 |
| 0.010524 | 42.444 |
| 0.010655 | 42.797 |
| 0.010678 | 43.125 |
| 0.007379 | 38.899 |
| 0.008897 | 39.917 |
| 0.009138 | 40.309 |
| 0.009793 | 40.58 |
| 0.009893 | 41.43 |
| 0.010234 | 41.672 |
| 0.010293 | 42.117 |
| 0.010472 | 42.224 |
| 0.010524 | 42.318 |
| 0.010655 | 42.386 |
| 0.010678 | 42.724 |
| 0.007379 | 38.765 |
| 0.008897 | 39.422 |
| 0.009138 | 40.091 |
| 0.009793 | 40.396 |
| 0.009908 | 41.26 |
| 0.010234 | 41.501 |
| 0.010293 | 41.674 |
| 0.010472 | 41.763 |
| 0.010524 | 42.188 |
| 0.010655 | 42.245 |
| 0.010678 | 42.305 |
| 0.007379 | 38.645 |
| 0.008897 | 39.293 |
| 0.009138 | 39.917 |
| 0.009793 | 40.198 |
| 0.009893 | 40.439 |
| 0.010234 | 40.975 |
| 0.010293 | 41.526 |
| 0.010472 | 41.643 |
| 0.010524 | 41.741 |
| 0.010655 | 42.145 |
| 0.010678 | 42.203 |
| 0.007379 | 38.536 |
| 0.008897 | 39.144 |
| 0.009138 | 39.745 |
| 0.009793 | 40.015 |
| 0.009908 | 40.269 |
| 0.010234 | 40.518 |
| 0.010293 | 41.001 |
| 0.010472 | 41.51 |
| 0.010524 | 41.613 |
| 0.010655 | 41.708 |
| 0.010678 | 42.104 |
| 0.007379 | 38.405 |
| 0.008897 | 39.026 |
| 0.009138 | 39.341 |
| 0.009793 | 39.889 |
| 0.009908 | 40.107 |
| 0.010234 | 40.392 |
| 0.010293 | 40.578 |
| 0.010472 | 41.371 |
| 0.010524 | 41.492 |
| 0.010655 | 41.584 |
| 0.010678 | 41.676 |
| 0.007379 | 38.334 |
| 0.008897 | 38.674 |
| 0.009138 | 39.217 |
| 0.009793 | 39.739 |
| 0.009893 | 39.976 |
| 0.010234 | 40.228 |
| 0.010293 | 40.458 |
| 0.010472 | 40.59 |
| 0.010524 | 41.375 |
| 0.010655 | 41.482 |
| 0.010678 | 41.571 |
| 0.007379 | 38.247 |
| 0.008897 | 38.584 |
| 0.009138 | 39.116 |
| 0.009793 | 39.629 |
| 0.009908 | 39.843 |
| 0.010234 | 40.092 |
| 0.010293 | 40.32 |
| 0.010472 | 40.488 |
| 0.010524 | 40.587 |
| 0.010655 | 40.998 |
| 0.010678 | 41.468 |